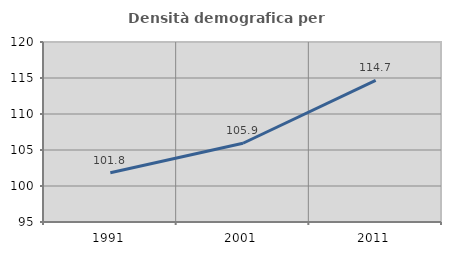
| Category | Densità demografica |
|---|---|
| 1991.0 | 101.829 |
| 2001.0 | 105.94 |
| 2011.0 | 114.68 |